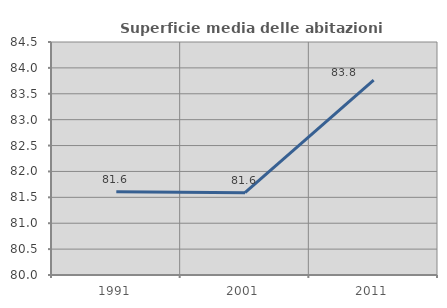
| Category | Superficie media delle abitazioni occupate |
|---|---|
| 1991.0 | 81.608 |
| 2001.0 | 81.589 |
| 2011.0 | 83.764 |